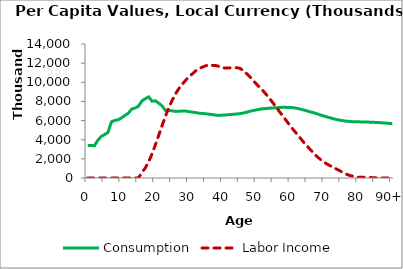
| Category | Consumption | Labor Income |
|---|---|---|
| 0 | 3404129.091 | 0 |
|  | 3390481.948 | 0 |
| 2 | 3375986.783 | 0 |
| 3 | 3945836.875 | 0 |
| 4 | 4345871.654 | 0 |
| 5 | 4539036.926 | 0 |
| 6 | 4766346.932 | 0 |
| 7 | 5865219.21 | 0 |
| 8 | 6017793.003 | 0 |
| 9 | 6080963.569 | 0 |
| 10 | 6277445.188 | 0 |
| 11 | 6538700.026 | 0 |
| 12 | 6766796.16 | 0 |
| 13 | 7202641.317 | 0 |
| 14 | 7304653.754 | 0 |
| 15 | 7503909.295 | 0 |
| 16 | 8035762.053 | 578586.737 |
| 17 | 8284864.96 | 1043153.854 |
| 18 | 8476604.624 | 1698594.966 |
| 19 | 8029238.205 | 2514913.73 |
| 20 | 8062237.684 | 3467561.1 |
| 21 | 7817132.548 | 4475304.907 |
| 22 | 7524713.667 | 5501046.575 |
| 23 | 7044446.952 | 6482171.712 |
| 24 | 7063887.003 | 7370188.179 |
| 25 | 7015507.503 | 8145027.018 |
| 26 | 6958763.334 | 8820969.491 |
| 27 | 6971214.589 | 9371155.048 |
| 28 | 6991512.173 | 9817390.117 |
| 29 | 6986944.82 | 10231793.844 |
| 30 | 6929691.63 | 10610471.911 |
| 31 | 6877341.398 | 10904800.732 |
| 32 | 6830808.438 | 11213660.443 |
| 33 | 6766801.129 | 11430391.21 |
| 34 | 6734835.674 | 11607322.503 |
| 35 | 6708530.721 | 11740608.018 |
| 36 | 6658082.474 | 11815010.009 |
| 37 | 6616875.385 | 11762990.923 |
| 38 | 6563281.303 | 11739974.36 |
| 39 | 6539956.561 | 11636732.839 |
| 40 | 6574886.18 | 11509483.105 |
| 41 | 6592854.664 | 11484827.362 |
| 42 | 6626567.233 | 11507992.118 |
| 43 | 6654512.242 | 11516375.518 |
| 44 | 6685767.041 | 11527646.121 |
| 45 | 6721290.877 | 11459334.505 |
| 46 | 6792811.255 | 11202632.421 |
| 47 | 6875140.545 | 10885467.709 |
| 48 | 6979891.159 | 10535501.776 |
| 49 | 7054958.857 | 10147142.448 |
| 50 | 7130209.206 | 9760570.03 |
| 51 | 7191460.726 | 9406778.759 |
| 52 | 7240266.28 | 9042449.742 |
| 53 | 7266250.76 | 8617542.524 |
| 54 | 7300999.489 | 8184342.878 |
| 55 | 7323740.263 | 7734091.211 |
| 56 | 7350137.282 | 7255394.175 |
| 57 | 7376431.749 | 6771853.895 |
| 58 | 7383639.592 | 6313392.7 |
| 59 | 7374360.853 | 5843042.631 |
| 60 | 7363519.518 | 5381877.892 |
| 61 | 7336786.129 | 4940683.183 |
| 62 | 7267632.513 | 4511871.494 |
| 63 | 7182654.51 | 4084130.194 |
| 64 | 7089122.841 | 3652311.569 |
| 65 | 6993392.302 | 3265795.633 |
| 66 | 6884068.031 | 2884162.221 |
| 67 | 6793306.084 | 2498561.979 |
| 68 | 6676841.777 | 2159296.794 |
| 69 | 6554768.026 | 1872408.079 |
| 70 | 6447049.349 | 1612156.267 |
| 71 | 6349546.885 | 1396179.291 |
| 72 | 6245142.487 | 1210979.13 |
| 73 | 6149520.178 | 1017157.665 |
| 74 | 6073803.313 | 855821.083 |
| 75 | 6007029.251 | 651196.075 |
| 76 | 5955528.059 | 468171.874 |
| 77 | 5917003.574 | 317298.439 |
| 78 | 5890906.695 | 217748.377 |
| 79 | 5877996.043 | 151036.136 |
| 80 | 5866922.62 | 65045.684 |
| 81 | 5860434.111 | 77771.174 |
| 82 | 5855745.65 | 72521.484 |
| 83 | 5839740.011 | 55215.659 |
| 84 | 5823849.546 | 37184.23 |
| 85 | 5809667.454 | 18215.159 |
| 86 | 5788447.242 | 4314.247 |
| 87 | 5765501.371 | 0 |
| 88 | 5737180.825 | 0 |
| 89 | 5707888.69 | 0 |
| 90+ | 5677788.916 | 0 |